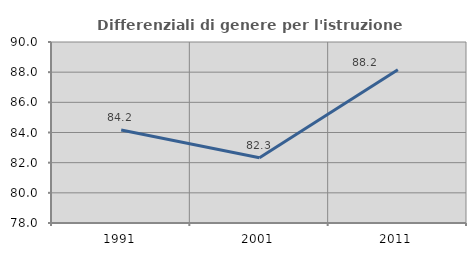
| Category | Differenziali di genere per l'istruzione superiore |
|---|---|
| 1991.0 | 84.17 |
| 2001.0 | 82.329 |
| 2011.0 | 88.157 |